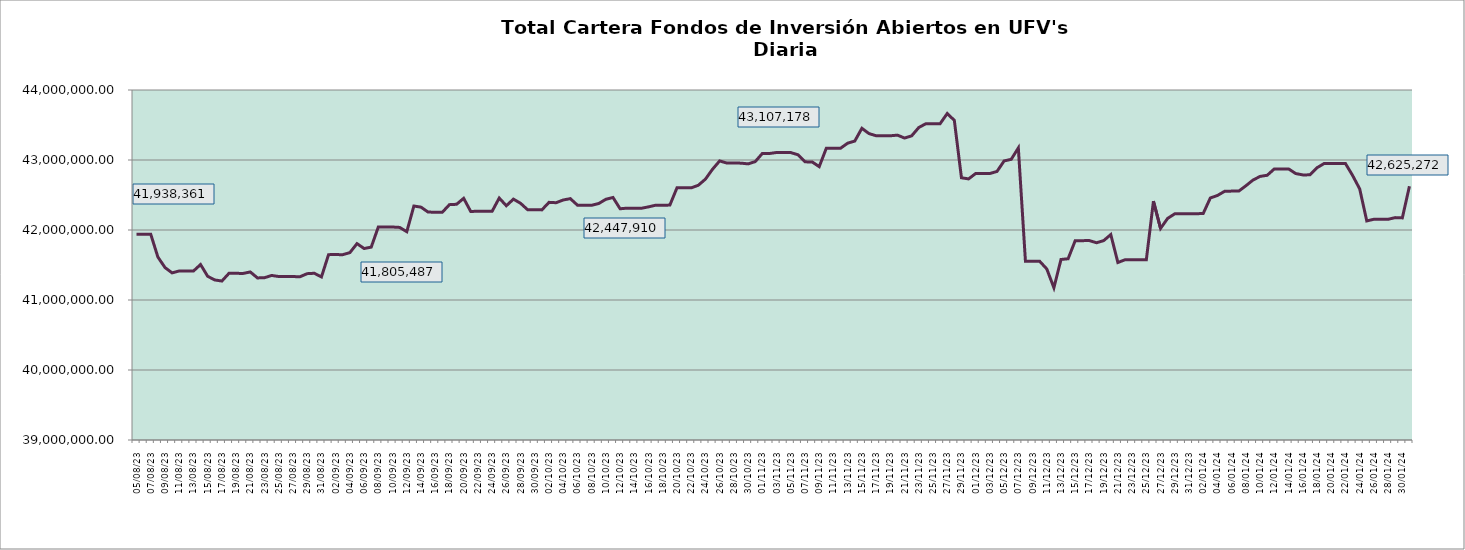
| Category | Cartera |
|---|---|
| 2023-08-05 | 41938360.51 |
| 2023-08-06 | 41938153.1 |
| 2023-08-07 | 41937942.81 |
| 2023-08-08 | 41613622.08 |
| 2023-08-09 | 41463554.1 |
| 2023-08-10 | 41387337.54 |
| 2023-08-11 | 41414887.74 |
| 2023-08-12 | 41413764.61 |
| 2023-08-13 | 41413559.38 |
| 2023-08-14 | 41506858.89 |
| 2023-08-15 | 41338608.62 |
| 2023-08-16 | 41286301.63 |
| 2023-08-17 | 41270756.92 |
| 2023-08-18 | 41381603.16 |
| 2023-08-19 | 41380463.76 |
| 2023-08-20 | 41380147.98 |
| 2023-08-21 | 41400521 |
| 2023-08-22 | 41315409.32 |
| 2023-08-23 | 41318591.69 |
| 2023-08-24 | 41350548.96 |
| 2023-08-25 | 41335593.37 |
| 2023-08-26 | 41334963.42 |
| 2023-08-27 | 41334311.09 |
| 2023-08-28 | 41333141.15 |
| 2023-08-29 | 41376370.28 |
| 2023-08-30 | 41381821.03 |
| 2023-08-31 | 41329459.21 |
| 2023-09-01 | 41648116.09 |
| 2023-09-02 | 41648474.97 |
| 2023-09-03 | 41647849.67 |
| 2023-09-04 | 41676927.49 |
| 2023-09-05 | 41805487.28 |
| 2023-09-06 | 41735369.04 |
| 2023-09-07 | 41755206.18 |
| 2023-09-08 | 42043641.71 |
| 2023-09-09 | 42043028.37 |
| 2023-09-10 | 42042422.03 |
| 2023-09-11 | 42036906.74 |
| 2023-09-12 | 41975855.01 |
| 2023-09-13 | 42342509.7 |
| 2023-09-14 | 42326533.24 |
| 2023-09-15 | 42255754.6 |
| 2023-09-16 | 42254713.29 |
| 2023-09-17 | 42253678.62 |
| 2023-09-18 | 42362270.42 |
| 2023-09-19 | 42367252.26 |
| 2023-09-20 | 42452605.95 |
| 2023-09-21 | 42263697.89 |
| 2023-09-22 | 42269201.01 |
| 2023-09-23 | 42268191.65 |
| 2023-09-24 | 42267202 |
| 2023-09-25 | 42456350.25 |
| 2023-09-26 | 42346714.77 |
| 2023-09-27 | 42440978.47 |
| 2023-09-28 | 42381579.11 |
| 2023-09-29 | 42289102.56 |
| 2023-09-30 | 42288198.85 |
| 2023-10-01 | 42287410.93 |
| 2023-10-02 | 42395019.87 |
| 2023-10-03 | 42389780.2 |
| 2023-10-04 | 42428838.54 |
| 2023-10-05 | 42447910.21 |
| 2023-10-06 | 42354744.63 |
| 2023-10-07 | 42353951.46 |
| 2023-10-08 | 42353157.81 |
| 2023-10-09 | 42378630.44 |
| 2023-10-10 | 42438859.82 |
| 2023-10-11 | 42464556.73 |
| 2023-10-12 | 42303351.79 |
| 2023-10-13 | 42312277.18 |
| 2023-10-14 | 42311563.61 |
| 2023-10-15 | 42310863.49 |
| 2023-10-16 | 42330496.99 |
| 2023-10-17 | 42354399.37 |
| 2023-10-18 | 42352016.37 |
| 2023-10-19 | 42356548.36 |
| 2023-10-20 | 42603214.79 |
| 2023-10-21 | 42602528.51 |
| 2023-10-22 | 42601916.62 |
| 2023-10-23 | 42639157.05 |
| 2023-10-24 | 42726911.12 |
| 2023-10-25 | 42868514.71 |
| 2023-10-26 | 42986683.86 |
| 2023-10-27 | 42956471.69 |
| 2023-10-28 | 42955894.05 |
| 2023-10-29 | 42955238.7 |
| 2023-10-30 | 42944597.6 |
| 2023-10-31 | 42976802.28 |
| 2023-11-01 | 43093358.77 |
| 2023-11-02 | 43092484.46 |
| 2023-11-03 | 43107178.36 |
| 2023-11-04 | 43106690.27 |
| 2023-11-05 | 43106091.65 |
| 2023-11-06 | 43074970.72 |
| 2023-11-07 | 42973358.77 |
| 2023-11-08 | 42972674.39 |
| 2023-11-09 | 42905181.05 |
| 2023-11-10 | 43168443.62 |
| 2023-11-11 | 43168308.58 |
| 2023-11-12 | 43168113.82 |
| 2023-11-13 | 43240373.99 |
| 2023-11-14 | 43270689.6 |
| 2023-11-15 | 43452656.87 |
| 2023-11-16 | 43377305.54 |
| 2023-11-17 | 43346398.83 |
| 2023-11-18 | 43346275.14 |
| 2023-11-19 | 43345996.41 |
| 2023-11-20 | 43355290.36 |
| 2023-11-21 | 43313520.47 |
| 2023-11-22 | 43345046.77 |
| 2023-11-23 | 43463951.13 |
| 2023-11-24 | 43518849.38 |
| 2023-11-25 | 43518689.33 |
| 2023-11-26 | 43518613.5 |
| 2023-11-27 | 43663890.35 |
| 2023-11-28 | 43566224.18 |
| 2023-11-29 | 42746411.65 |
| 2023-11-30 | 42729756.9 |
| 2023-12-01 | 42807258.98 |
| 2023-12-02 | 42807197.19 |
| 2023-12-03 | 42807092.44 |
| 2023-12-04 | 42836421.66 |
| 2023-12-05 | 42986681.9 |
| 2023-12-06 | 43009721.06 |
| 2023-12-07 | 43172268.64 |
| 2023-12-08 | 41553464.95 |
| 2023-12-09 | 41553353.58 |
| 2023-12-10 | 41553233.21 |
| 2023-12-11 | 41443536.84 |
| 2023-12-12 | 41175240.65 |
| 2023-12-13 | 41578691.31 |
| 2023-12-14 | 41589415.94 |
| 2023-12-15 | 41848065.8 |
| 2023-12-16 | 41848147.79 |
| 2023-12-17 | 41848333.27 |
| 2023-12-18 | 41817881.84 |
| 2023-12-19 | 41848149.89 |
| 2023-12-20 | 41934834.15 |
| 2023-12-21 | 41535661.54 |
| 2023-12-22 | 41574569.14 |
| 2023-12-23 | 41574677.24 |
| 2023-12-24 | 41574915.52 |
| 2023-12-25 | 41575088.47 |
| 2023-12-26 | 42411895.63 |
| 2023-12-27 | 42022821.12 |
| 2023-12-28 | 42166018.8 |
| 2023-12-29 | 42231460.7 |
| 2023-12-30 | 42231676.24 |
| 2023-12-31 | 42231796.91 |
| 2024-01-01 | 42231903.29 |
| 2024-01-02 | 42236447.68 |
| 2024-01-03 | 42457468.24 |
| 2024-01-04 | 42493086.93 |
| 2024-01-05 | 42552233.95 |
| 2024-01-06 | 42555635.47 |
| 2024-01-07 | 42555772.03 |
| 2024-01-08 | 42632171.02 |
| 2024-01-09 | 42713507.47 |
| 2024-01-10 | 42765649.93 |
| 2024-01-11 | 42781927.93 |
| 2024-01-12 | 42873045.01 |
| 2024-01-13 | 42872948.65 |
| 2024-01-14 | 42872965.72 |
| 2024-01-15 | 42806763.91 |
| 2024-01-16 | 42787008.27 |
| 2024-01-17 | 42787779.66 |
| 2024-01-18 | 42889319.06 |
| 2024-01-19 | 42949948.17 |
| 2024-01-20 | 42949910.14 |
| 2024-01-21 | 42949843.04 |
| 2024-01-22 | 42950154.71 |
| 2024-01-23 | 42780085 |
| 2024-01-24 | 42588321.27 |
| 2024-01-25 | 42129616.68 |
| 2024-01-26 | 42153365.84 |
| 2024-01-27 | 42153328.67 |
| 2024-01-28 | 42153251.57 |
| 2024-01-29 | 42176857.54 |
| 2024-01-30 | 42172961.56 |
| 2024-01-31 | 42625272.49 |